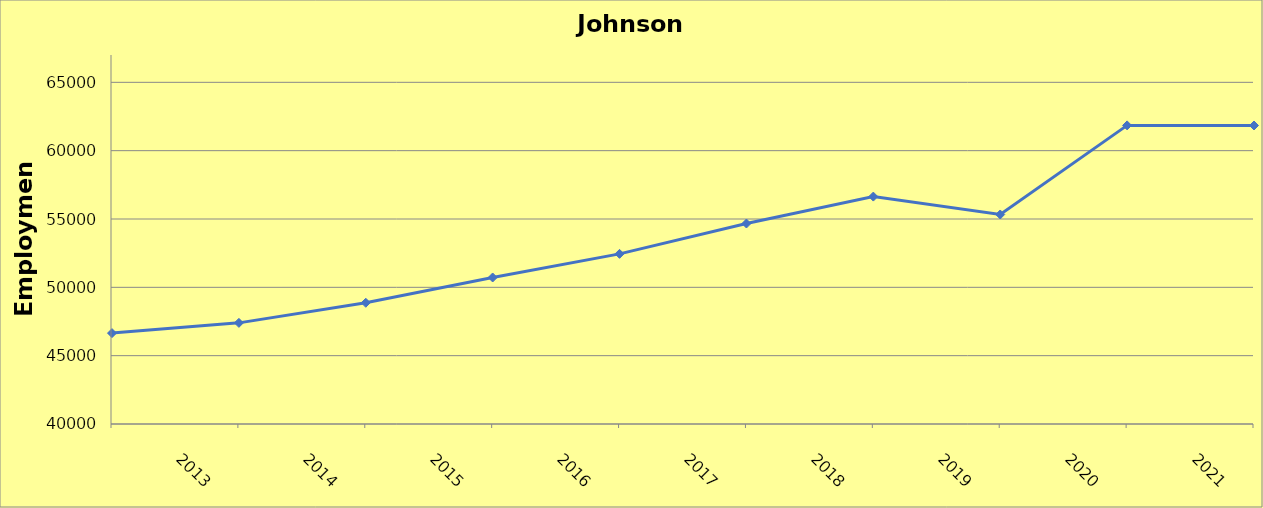
| Category | Johnson County |
|---|---|
| 2013.0 | 46650 |
| 2014.0 | 47400 |
| 2015.0 | 48870 |
| 2016.0 | 50720 |
| 2017.0 | 52450 |
| 2018.0 | 54670 |
| 2019.0 | 56640 |
| 2020.0 | 55330 |
| 2021.0 | 61850 |
| 2022.0 | 61842 |